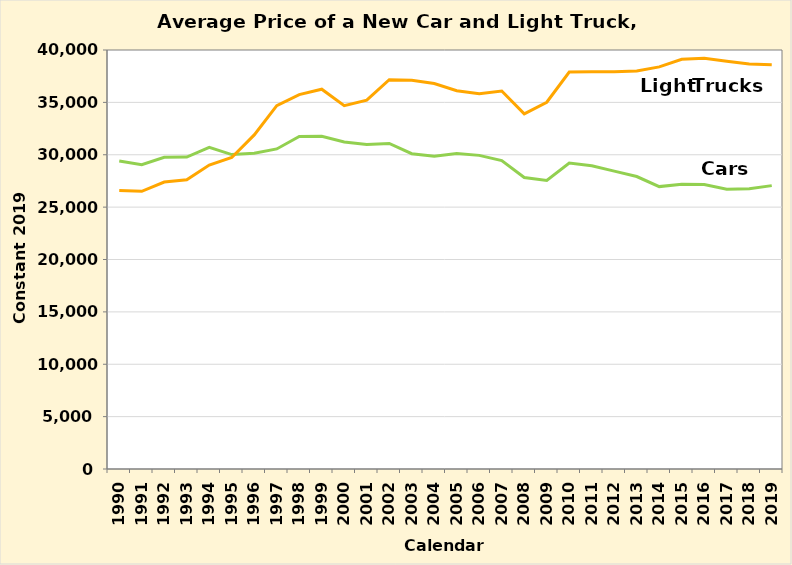
| Category | Series 1 | Series 4 |
|---|---|---|
| 1990.0 | 29405.129 | 26587.735 |
| 1991.0 | 29049.306 | 26511.841 |
| 1992.0 | 29757.793 | 27391.771 |
| 1993.0 | 29782.22 | 27620.511 |
| 1994.0 | 30702.328 | 29017.629 |
| 1995.0 | 30014.605 | 29734.569 |
| 1996.0 | 30150.19 | 31895.076 |
| 1997.0 | 30554.671 | 34688.887 |
| 1998.0 | 31742.03 | 35739.831 |
| 1999.0 | 31766.478 | 36256.115 |
| 2000.0 | 31221.955 | 34685.329 |
| 2001.0 | 30984.844 | 35210.208 |
| 2002.0 | 31073.718 | 37161.108 |
| 2003.0 | 30099.826 | 37118.474 |
| 2004.0 | 29867.404 | 36799.358 |
| 2005.0 | 30124.177 | 36116.821 |
| 2006.0 | 29941.648 | 35822.148 |
| 2007.0 | 29448.646 | 36084.589 |
| 2008.0 | 27822.543 | 33907.59 |
| 2009.0 | 27537.63 | 35011.873 |
| 2010.0 | 29201.453 | 37897.567 |
| 2011.0 | 28949.384 | 37921.137 |
| 2012.0 | 28434.784 | 37919.996 |
| 2013.0 | 27920.591 | 37989.022 |
| 2014.0 | 26959.282 | 38387.369 |
| 2015.0 | 27180.861 | 39107.007 |
| 2016.0 | 27151.977 | 39222.891 |
| 2017.0 | 26716.723 | 38930.892 |
| 2018.0 | 26754.565 | 38654.724 |
| 2019.0 | 27052.084 | 38598.43 |